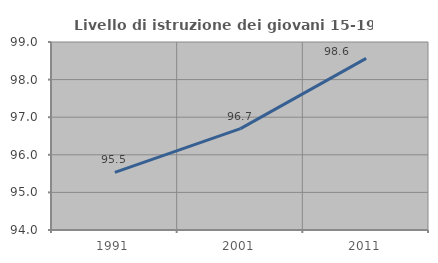
| Category | Livello di istruzione dei giovani 15-19 anni |
|---|---|
| 1991.0 | 95.534 |
| 2001.0 | 96.697 |
| 2011.0 | 98.565 |